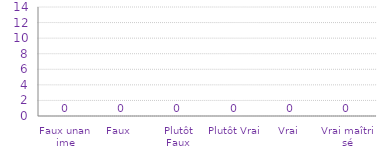
| Category | Histogramme de Véracité des Processus
Management |
|---|---|
| Faux unanime | 0 |
| Faux  | 0 |
| Plutôt Faux | 0 |
| Plutôt Vrai | 0 |
| Vrai  | 0 |
| Vrai maîtrisé | 0 |